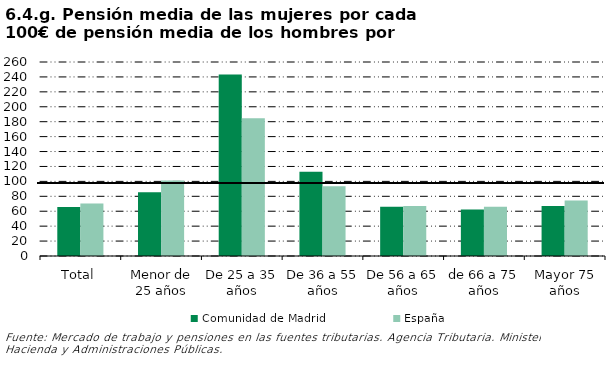
| Category | Comunidad de Madrid | España |
|---|---|---|
| Total | 65.699 | 70.385 |
| Menor de 25 años | 85.281 | 101.32 |
| De 25 a 35 años | 243.201 | 184.532 |
| De 36 a 55 años | 112.845 | 93.396 |
| De 56 a 65 años | 66.072 | 67.056 |
| de 66 a 75 años | 62.404 | 66.165 |
| Mayor 75 años | 66.856 | 74.309 |